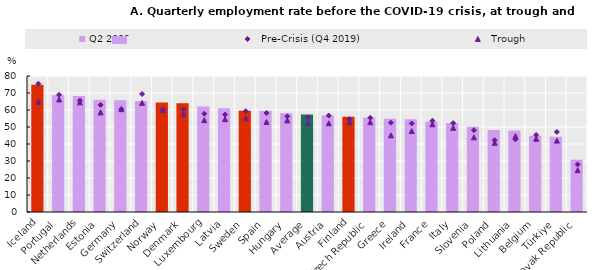
| Category | Q2 2022 |
|---|---|
| Iceland | 74.9 |
| Portugal | 68.7 |
| Netherlands | 68.3 |
| Estonia | 66 |
| Germany | 65.8 |
| Switzerland | 65.3 |
| Norway | 64.4 |
| Denmark | 63.9 |
| Luxembourg | 62.1 |
| Latvia | 61.1 |
| Sweden | 59.6 |
| Spain | 59.5 |
| Hungary | 58.1 |
| Average | 57.387 |
| Austria | 56.8 |
| Finland | 56.1 |
| Czech Republic | 55.5 |
| Greece | 54.8 |
| Ireland | 54.5 |
| France | 53.2 |
| Italy | 52.4 |
| Slovenia | 50.1 |
| Poland | 48.3 |
| Lithuania | 48 |
| Belgium | 44.9 |
| Türkiye | 44.3 |
| Slovak Republic | 30.8 |